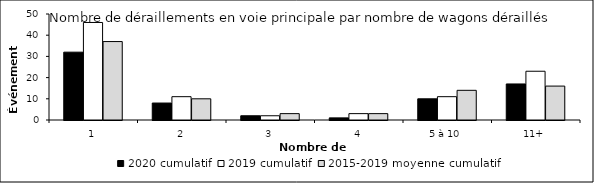
| Category | 2020 cumulatif | 2019 cumulatif | 2015-2019 moyenne cumulatif |
|---|---|---|---|
| 1 | 32 | 46 | 37 |
| 2 | 8 | 11 | 10 |
| 3 | 2 | 2 | 3 |
| 4 | 1 | 3 | 3 |
| 5 à 10 | 10 | 11 | 14 |
| 11+ | 17 | 23 | 16 |